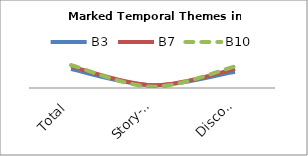
| Category | B3 | B7 | B10 |
|---|---|---|---|
| Total | 14 | 16 | 17 |
| Story-time | 2 | 2 | 1 |
| Discourse-time | 12 | 14 | 16 |